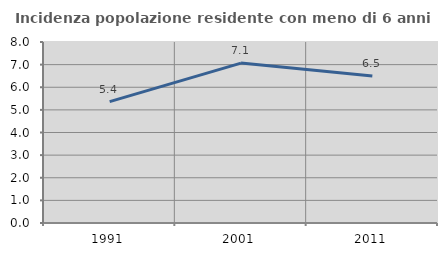
| Category | Incidenza popolazione residente con meno di 6 anni |
|---|---|
| 1991.0 | 5.364 |
| 2001.0 | 7.068 |
| 2011.0 | 6.495 |